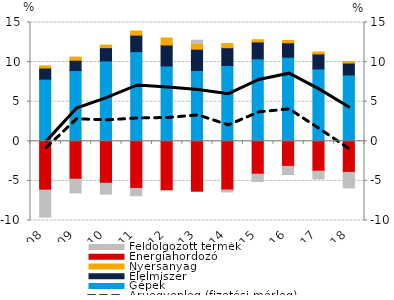
| Category | Gépek | Élelmiszer | Nyersanyag | Energiahordozó | Feldolgozott termék |
|---|---|---|---|---|---|
| 2008.0 | 7.848 | 1.4 | 0.277 | -6.162 | -3.406 |
| 2009.0 | 8.93 | 1.307 | 0.4 | -4.787 | -1.723 |
| 2010.0 | 10.143 | 1.685 | 0.319 | -5.299 | -1.373 |
| 2011.0 | 11.319 | 2.084 | 0.521 | -5.947 | -0.922 |
| 2012.0 | 9.515 | 2.649 | 0.875 | -6.214 | -0.043 |
| 2013.0 | 8.941 | 2.693 | 0.712 | -6.304 | 0.422 |
| 2014.0 | 9.569 | 2.25 | 0.521 | -6.153 | -0.241 |
| 2015.0 | 10.416 | 2.125 | 0.285 | -4.154 | -0.92 |
| 2016.0 | 10.619 | 1.818 | 0.301 | -3.168 | -1.03 |
| 2017.0 | 9.137 | 1.894 | 0.241 | -3.771 | -0.982 |
| 2018.0 | 8.377 | 1.505 | 0.179 | -3.925 | -1.961 |